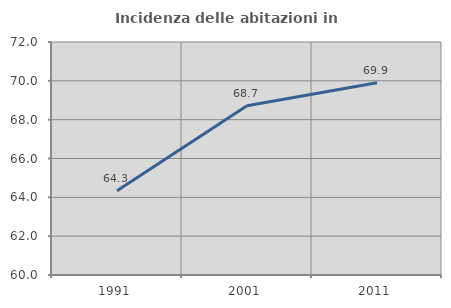
| Category | Incidenza delle abitazioni in proprietà  |
|---|---|
| 1991.0 | 64.342 |
| 2001.0 | 68.718 |
| 2011.0 | 69.9 |